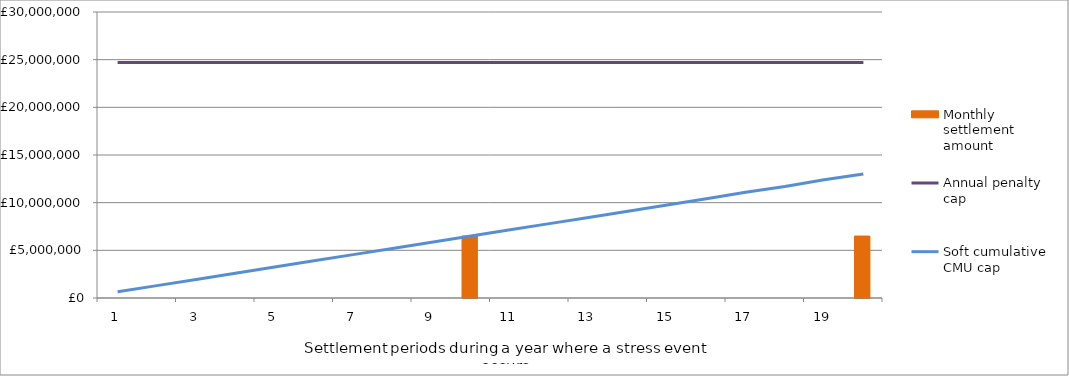
| Category | Monthly settlement amount  |
|---|---|
| 0 | 0 |
| 1 | 0 |
| 2 | 0 |
| 3 | 0 |
| 4 | 0 |
| 5 | 0 |
| 6 | 0 |
| 7 | 0 |
| 8 | 0 |
| 9 | 6500000 |
| 10 | 0 |
| 11 | 0 |
| 12 | 0 |
| 13 | 0 |
| 14 | 0 |
| 15 | 0 |
| 16 | 0 |
| 17 | 0 |
| 18 | 0 |
| 19 | 6500000 |